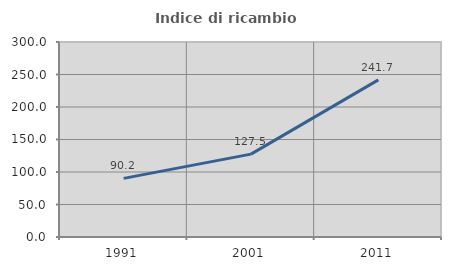
| Category | Indice di ricambio occupazionale  |
|---|---|
| 1991.0 | 90.193 |
| 2001.0 | 127.487 |
| 2011.0 | 241.667 |